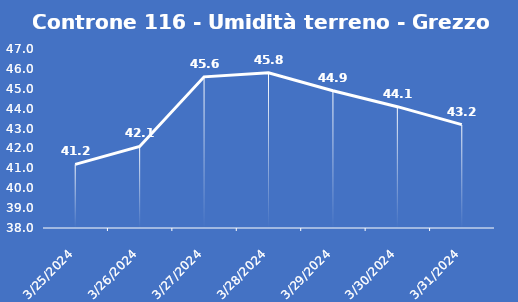
| Category | Controne 116 - Umidità terreno - Grezzo (%VWC) |
|---|---|
| 3/25/24 | 41.2 |
| 3/26/24 | 42.1 |
| 3/27/24 | 45.6 |
| 3/28/24 | 45.8 |
| 3/29/24 | 44.9 |
| 3/30/24 | 44.1 |
| 3/31/24 | 43.2 |